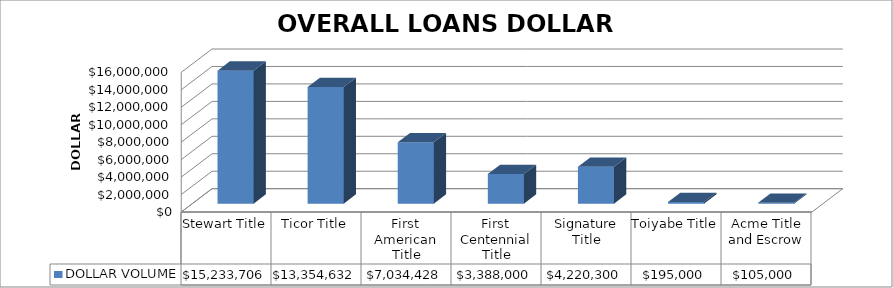
| Category | DOLLAR VOLUME |
|---|---|
| Stewart Title | 15233706 |
| Ticor Title | 13354632 |
| First American Title | 7034428 |
| First Centennial Title | 3388000 |
| Signature Title | 4220300 |
| Toiyabe Title | 195000 |
| Acme Title and Escrow | 105000 |